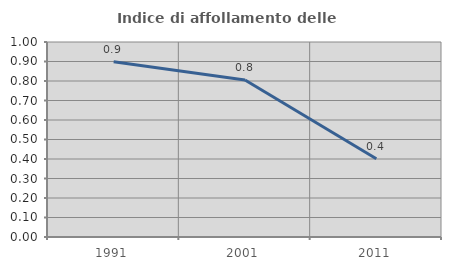
| Category | Indice di affollamento delle abitazioni  |
|---|---|
| 1991.0 | 0.899 |
| 2001.0 | 0.805 |
| 2011.0 | 0.402 |